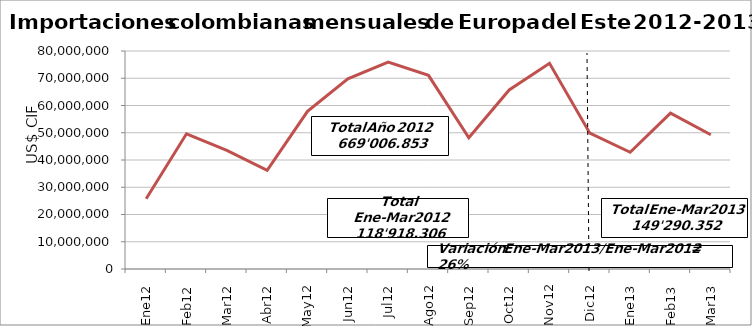
| Category | Series 0 |
|---|---|
| 0 | 25766944.19 |
| 1 | 49615373.93 |
| 2 | 43535987.78 |
| 3 | 36243071.81 |
| 4 | 57859799.21 |
| 5 | 69810603.47 |
| 6 | 75928291.06 |
| 7 | 71063765.89 |
| 8 | 48149572.52 |
| 9 | 65695325.33 |
| 10 | 75497663.8 |
| 11 | 49840454.39 |
| 12 | 42817590.58 |
| 13 | 57190663.76 |
| 14 | 49282097.56 |